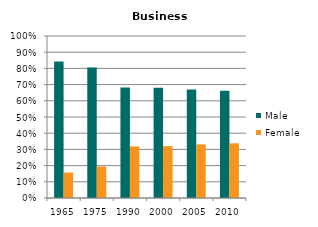
| Category | Male | Female |
|---|---|---|
| 1965.0 | 0.843 | 0.157 |
| 1975.0 | 0.806 | 0.194 |
| 1990.0 | 0.681 | 0.319 |
| 2000.0 | 0.68 | 0.32 |
| 2005.0 | 0.669 | 0.331 |
| 2010.0 | 0.663 | 0.337 |